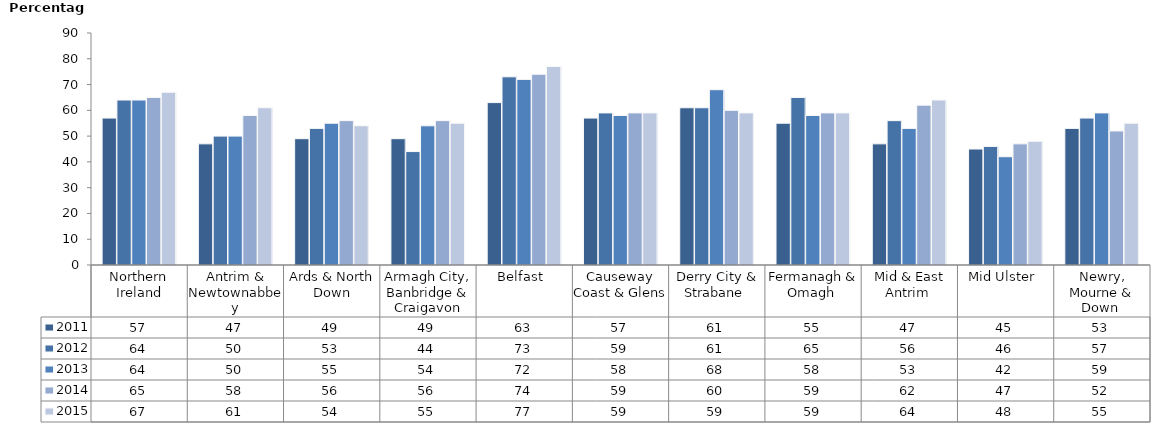
| Category | 2011 | 2012 | 2013 | 2014 | 2015 |
|---|---|---|---|---|---|
| Northern Ireland | 57 | 64 | 64 | 65 | 67 |
| Antrim & Newtownabbey | 47 | 50 | 50 | 58 | 61 |
| Ards & North Down | 49 | 53 | 55 | 56 | 54 |
| Armagh City, Banbridge & Craigavon | 49 | 44 | 54 | 56 | 55 |
| Belfast  | 63 | 73 | 72 | 74 | 77 |
| Causeway Coast & Glens  | 57 | 59 | 58 | 59 | 59 |
| Derry City & Strabane  | 61 | 61 | 68 | 60 | 59 |
| Fermanagh & Omagh  | 55 | 65 | 58 | 59 | 59 |
| Mid & East Antrim  | 47 | 56 | 53 | 62 | 64 |
| Mid Ulster  | 45 | 46 | 42 | 47 | 48 |
| Newry, Mourne & Down  | 53 | 57 | 59 | 52 | 55 |